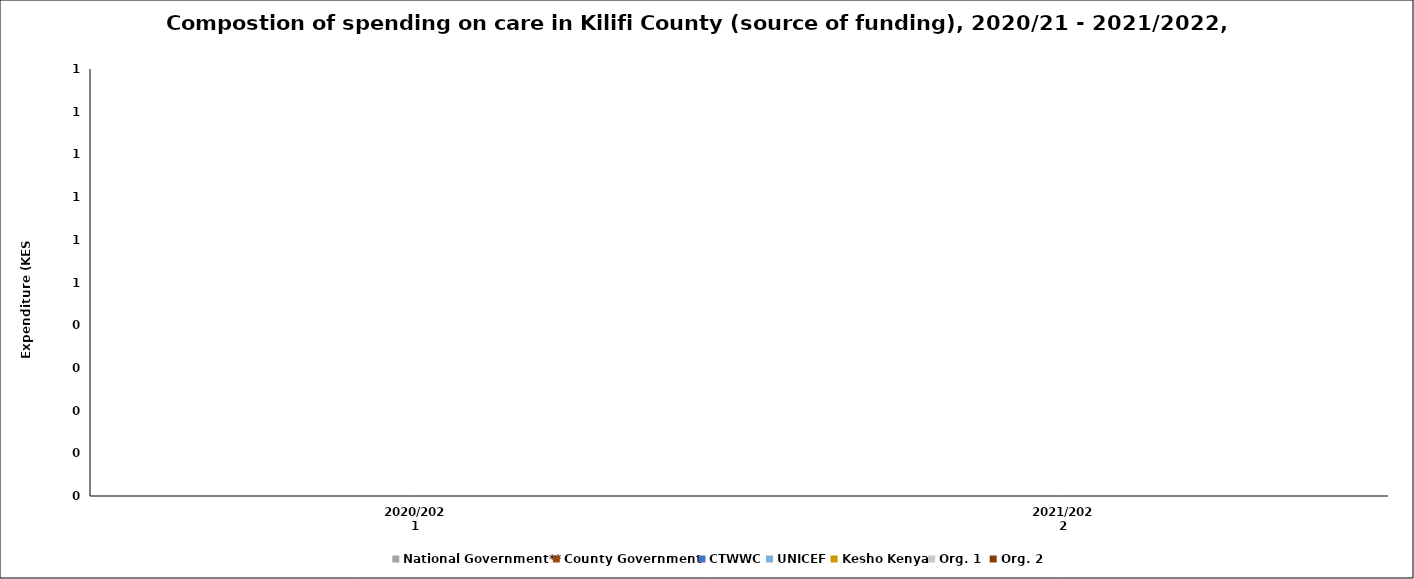
| Category | National Government** | County Government  | CTWWC | UNICEF | Kesho Kenya | Org. 1  | Org. 2 |
|---|---|---|---|---|---|---|---|
| 2020/2021 | 0 | 0 | 0 | 0 | 0 | 0 | 0 |
| 2021/2022 | 0 | 0 | 0 | 0 | 0 | 0 | 0 |